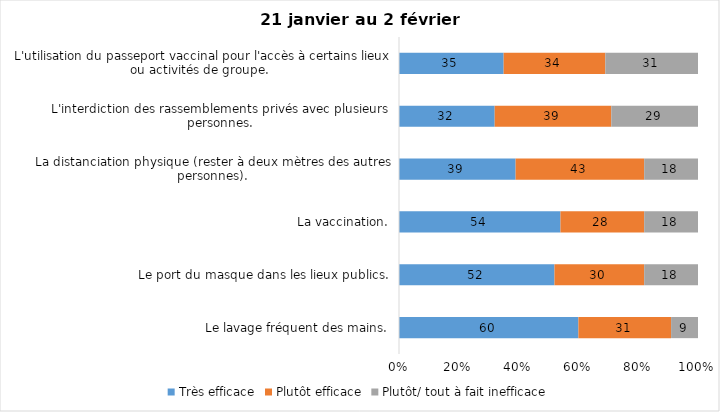
| Category | Très efficace | Plutôt efficace | Plutôt/ tout à fait inefficace |
|---|---|---|---|
| Le lavage fréquent des mains. | 60 | 31 | 9 |
| Le port du masque dans les lieux publics. | 52 | 30 | 18 |
| La vaccination. | 54 | 28 | 18 |
| La distanciation physique (rester à deux mètres des autres personnes). | 39 | 43 | 18 |
| L'interdiction des rassemblements privés avec plusieurs personnes. | 32 | 39 | 29 |
| L'utilisation du passeport vaccinal pour l'accès à certains lieux ou activités de groupe.  | 35 | 34 | 31 |